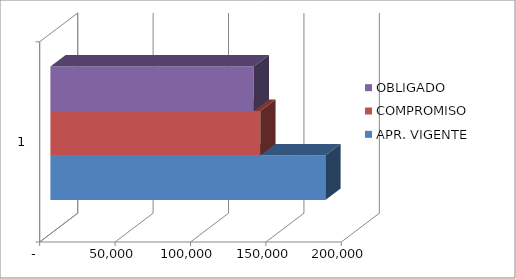
| Category | APR. VIGENTE | COMPROMISO | % EJECUTADO | OBLIGADO |
|---|---|---|---|---|
| 0 | 182341.791 | 139205 |  | 134873 |